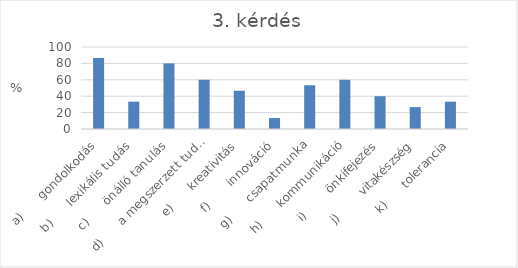
| Category | Series 0 |
|---|---|
| a)      gondolkodás | 86.67 |
| b)      lexikális tudás | 33.33 |
| c)      önálló tanulás | 80 |
| d)      a megszerzett tudás alkalmazása | 60 |
| e)      kreativitás | 46.67 |
| f)       innováció | 13.33 |
| g)      csapatmunka | 53.33 |
| h)      kommunikáció | 60 |
| i)        önkifejezés | 40 |
| j)        vitakészség | 26.67 |
| k)      tolerancia | 33.33 |